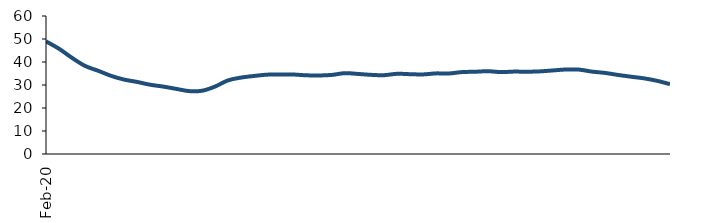
| Category | Series 0 |
|---|---|
| 2020-02-01 | 48.978 |
| 2020-03-01 | 45.766 |
| 2020-04-01 | 41.808 |
| 2020-05-01 | 38.31 |
| 2020-06-01 | 36.214 |
| 2020-07-01 | 33.993 |
| 2020-08-01 | 32.365 |
| 2020-09-01 | 31.338 |
| 2020-10-01 | 30.13 |
| 2020-11-01 | 29.326 |
| 2020-12-01 | 28.333 |
| 2021-01-01 | 27.356 |
| 2021-02-01 | 27.502 |
| 2021-03-01 | 29.312 |
| 2021-04-01 | 32.007 |
| 2021-05-01 | 33.224 |
| 2021-06-01 | 33.927 |
| 2021-07-01 | 34.496 |
| 2021-08-01 | 34.565 |
| 2021-09-01 | 34.562 |
| 2021-10-01 | 34.221 |
| 2021-11-01 | 34.137 |
| 2021-12-01 | 34.397 |
| 2022-01-01 | 35.154 |
| 2022-02-01 | 34.808 |
| 2022-03-01 | 34.415 |
| 2022-04-01 | 34.261 |
| 2022-05-01 | 34.87 |
| 2022-06-01 | 34.705 |
| 2022-07-01 | 34.592 |
| 2022-08-01 | 35.045 |
| 2022-09-01 | 35.003 |
| 2022-10-01 | 35.616 |
| 2022-11-01 | 35.763 |
| 2022-12-01 | 36.005 |
| 2023-01-01 | 35.604 |
| 2023-02-01 | 35.827 |
| 2023-03-01 | 35.769 |
| 2023-04-01 | 35.924 |
| 2023-05-01 | 36.331 |
| 2023-06-01 | 36.74 |
| 2023-07-01 | 36.693 |
| 2023-08-01 | 35.824 |
| 2023-09-01 | 35.253 |
| 2023-10-01 | 34.375 |
| 2023-11-01 | 33.606 |
| 2023-12-01 | 32.893 |
| 2024-01-01 | 31.825 |
| 2024-02-01 | 30.365 |